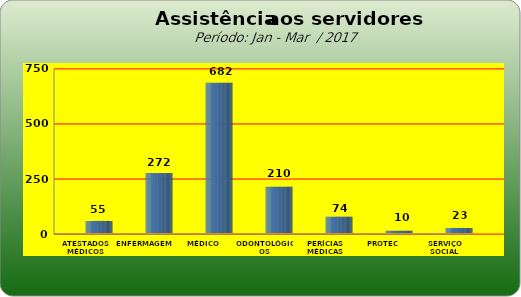
| Category | Series 0 |
|---|---|
| ATESTADOS MÉDICOS | 55 |
| ENFERMAGEM | 272 |
| MÉDICO | 682 |
| ODONTOLÓGICOS | 210 |
| PERÍCIAS MÉDICAS | 74 |
| PROTEC | 10 |
| SERVIÇO SOCIAL | 23 |